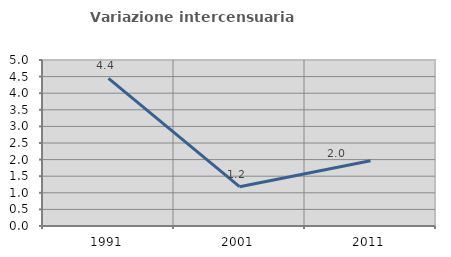
| Category | Variazione intercensuaria annua |
|---|---|
| 1991.0 | 4.445 |
| 2001.0 | 1.184 |
| 2011.0 | 1.968 |